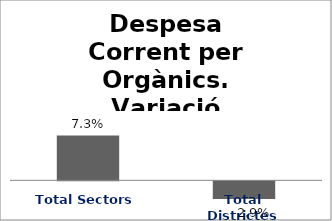
| Category | Series 0 |
|---|---|
| Total Sectors | 0.073 |
| Total Districtes | -0.029 |